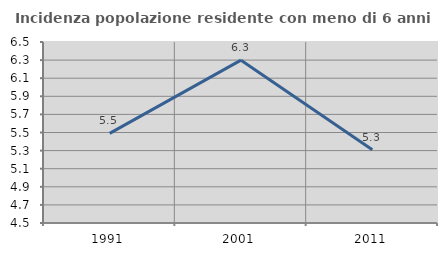
| Category | Incidenza popolazione residente con meno di 6 anni |
|---|---|
| 1991.0 | 5.49 |
| 2001.0 | 6.299 |
| 2011.0 | 5.31 |